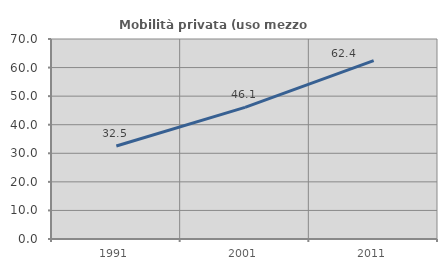
| Category | Mobilità privata (uso mezzo privato) |
|---|---|
| 1991.0 | 32.546 |
| 2001.0 | 46.073 |
| 2011.0 | 62.433 |